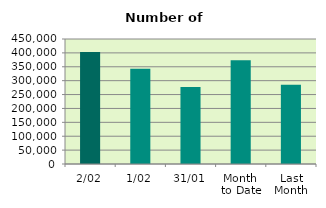
| Category | Series 0 |
|---|---|
| 2/02 | 403482 |
| 1/02 | 342932 |
| 31/01 | 276806 |
| Month 
to Date | 373207 |
| Last
Month | 285405.636 |